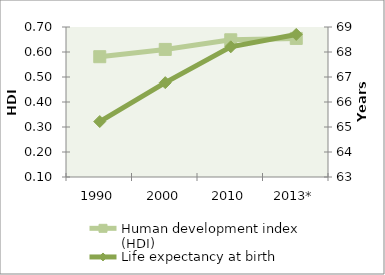
| Category | Human development index (HDI) |
|---|---|
| 1990 | 0.581 |
| 2000 | 0.61 |
| 2010 | 0.649 |
| 2013* | 0.654 |